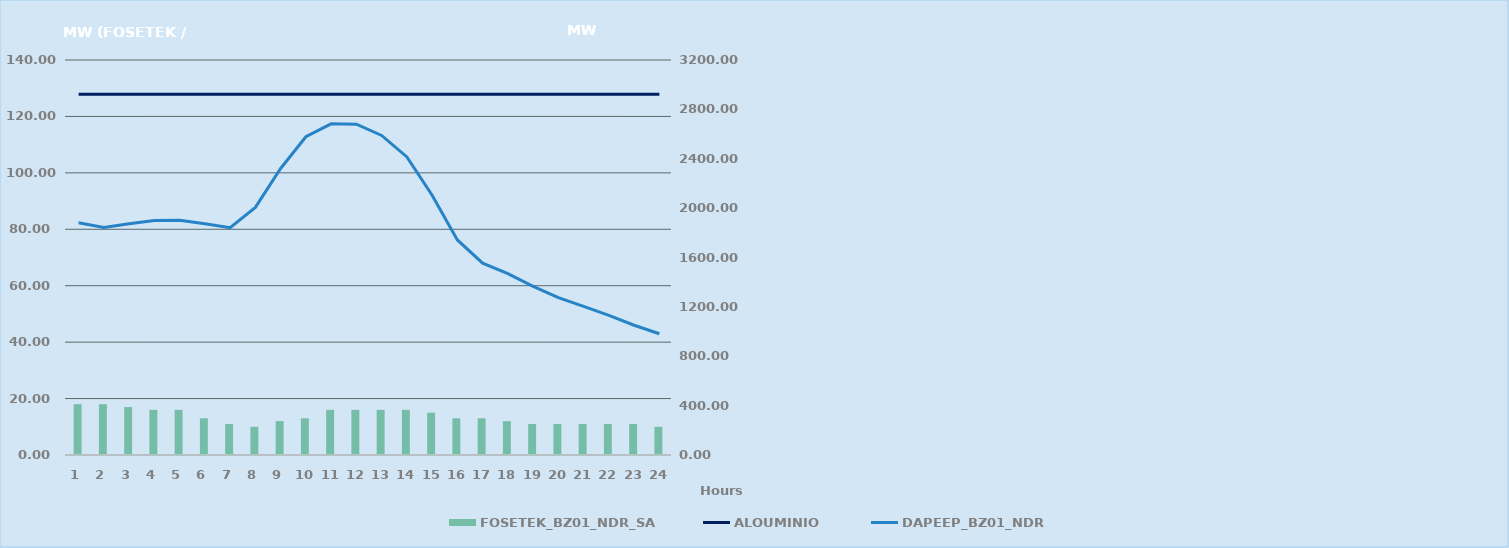
| Category | FOSETEK_BZ01_NDR_SA |
|---|---|
| 0 | 18 |
| 1 | 18 |
| 2 | 17 |
| 3 | 16 |
| 4 | 16 |
| 5 | 13 |
| 6 | 11 |
| 7 | 10 |
| 8 | 12 |
| 9 | 13 |
| 10 | 16 |
| 11 | 16 |
| 12 | 16 |
| 13 | 16 |
| 14 | 15 |
| 15 | 13 |
| 16 | 13 |
| 17 | 12 |
| 18 | 11 |
| 19 | 11 |
| 20 | 11 |
| 21 | 11 |
| 22 | 11 |
| 23 | 10 |